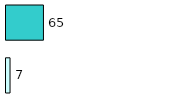
| Category | Series 0 | Series 1 |
|---|---|---|
| 0 | 7 | 65 |